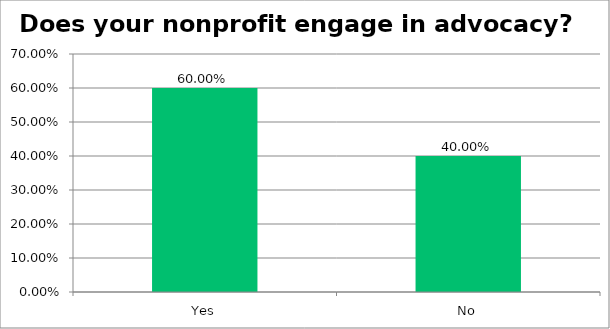
| Category | Responses |
|---|---|
| Yes | 0.6 |
| No | 0.4 |